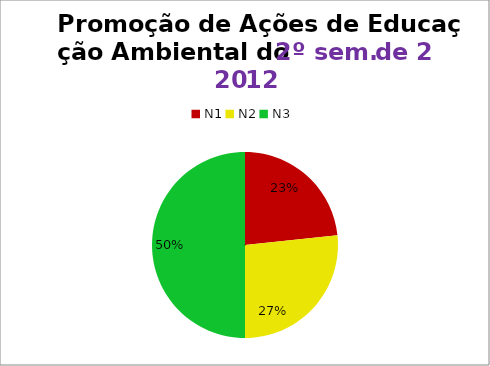
| Category | 2º/12 |
|---|---|
| N1 | 7 |
| N2 | 8 |
| N3 | 15 |